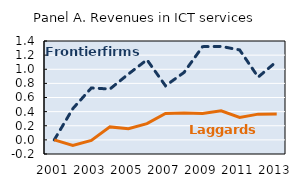
| Category | Series 0 | Series 1 |
|---|---|---|
| 2001.0 | 0 | 0 |
| 2002.0 | 0.442 | -0.079 |
| 2003.0 | 0.735 | -0.007 |
| 2004.0 | 0.72 | 0.184 |
| 2005.0 | 0.932 | 0.157 |
| 2006.0 | 1.134 | 0.229 |
| 2007.0 | 0.766 | 0.375 |
| 2008.0 | 0.955 | 0.381 |
| 2009.0 | 1.32 | 0.373 |
| 2010.0 | 1.324 | 0.411 |
| 2011.0 | 1.273 | 0.318 |
| 2012.0 | 0.889 | 0.365 |
| 2013.0 | 1.111 | 0.365 |